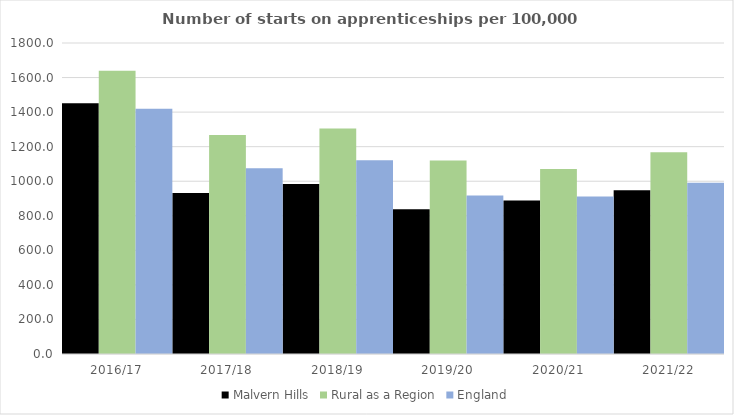
| Category | Malvern Hills | Rural as a Region | England |
|---|---|---|---|
| 2016/17 | 1451 | 1638.789 | 1420 |
| 2017/18 | 932 | 1267.474 | 1075 |
| 2018/19 | 984 | 1304.57 | 1122 |
| 2019/20 | 838 | 1119.662 | 918 |
| 2020/21 | 889 | 1070.748 | 912 |
| 2021/22 | 948 | 1167.68 | 991 |